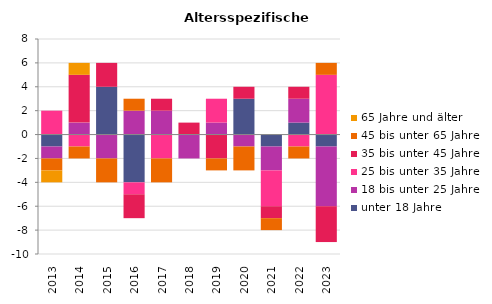
| Category | unter 18 Jahre | 18 bis unter 25 Jahre | 25 bis unter 35 Jahre | 35 bis unter 45 Jahre | 45 bis unter 65 Jahre | 65 Jahre und älter |
|---|---|---|---|---|---|---|
| 2013.0 | -1 | -1 | 2 | 0 | -1 | -1 |
| 2014.0 | 0 | 1 | -1 | 4 | -1 | 1 |
| 2015.0 | 4 | -2 | 0 | 2 | -2 | 0 |
| 2016.0 | -4 | 2 | -1 | -2 | 1 | 0 |
| 2017.0 | 0 | 2 | -2 | 1 | -2 | 0 |
| 2018.0 | 0 | -2 | 0 | 1 | 0 | 0 |
| 2019.0 | 0 | 1 | 2 | -2 | -1 | 0 |
| 2020.0 | 3 | -1 | 0 | 1 | -2 | 0 |
| 2021.0 | -1 | -2 | -3 | -1 | -1 | 0 |
| 2022.0 | 1 | 2 | -1 | 1 | -1 | 0 |
| 2023.0 | -1 | -5 | 5 | -3 | 1 | 0 |